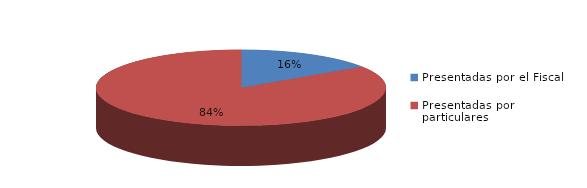
| Category | Series 0 |
|---|---|
| Presentadas por el Fiscal | 29 |
| Presentadas por particulares | 157 |